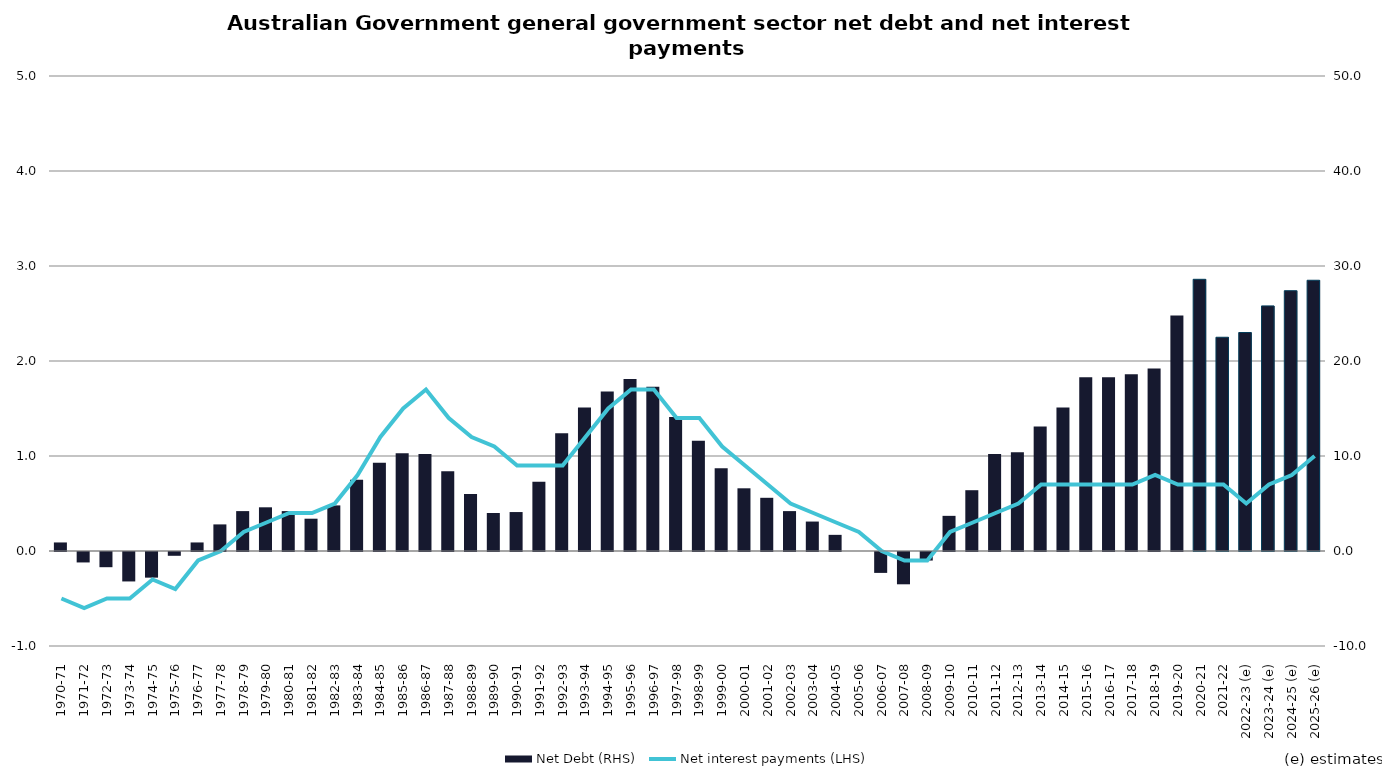
| Category | Net Debt (RHS) |
|---|---|
| 1970-71 | 0.9 |
| 1971-72 | -1.1 |
| 1972-73 | -1.6 |
| 1973-74 | -3.1 |
| 1974-75 | -2.7 |
| 1975-76 | -0.4 |
| 1976-77 | 0.9 |
| 1977-78 | 2.8 |
| 1978-79 | 4.2 |
| 1979-80 | 4.6 |
| 1980-81 | 4.2 |
| 1981-82 | 3.4 |
| 1982-83 | 4.8 |
| 1983-84 | 7.5 |
| 1984-85 | 9.3 |
| 1985-86 | 10.3 |
| 1986-87 | 10.2 |
| 1987-88 | 8.4 |
| 1988-89 | 6 |
| 1989-90 | 4 |
| 1990-91 | 4.1 |
| 1991-92 | 7.3 |
| 1992-93 | 12.4 |
| 1993-94 | 15.1 |
| 1994-95 | 16.8 |
| 1995-96 | 18.1 |
| 1996-97 | 17.3 |
| 1997-98 | 14.1 |
| 1998-99 | 11.6 |
| 1999-00 | 8.7 |
| 2000-01 | 6.6 |
| 2001-02 | 5.6 |
| 2002-03 | 4.2 |
| 2003-04 | 3.1 |
| 2004-05 | 1.7 |
| 2005-06 | 0 |
| 2006-07 | -2.2 |
| 2007-08 | -3.4 |
| 2008-09 | -0.9 |
| 2009-10 | 3.7 |
| 2010-11 | 6.4 |
| 2011-12 | 10.2 |
| 2012-13 | 10.4 |
| 2013-14 | 13.1 |
| 2014-15 | 15.1 |
| 2015-16 | 18.3 |
| 2016-17 | 18.3 |
| 2017-18 | 18.6 |
| 2018-19 | 19.2 |
| 2019-20 | 24.8 |
| 2020-21 (e) | 28.6 |
| 2021-22 (e) | 22.5 |
| 2022-23 (e) | 23 |
| 2023-24 (e) | 25.8 |